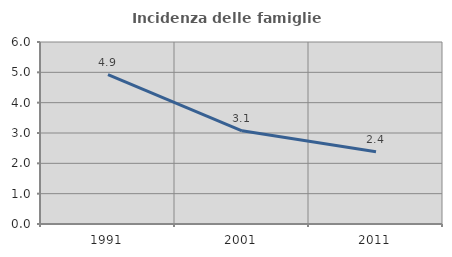
| Category | Incidenza delle famiglie numerose |
|---|---|
| 1991.0 | 4.928 |
| 2001.0 | 3.072 |
| 2011.0 | 2.381 |